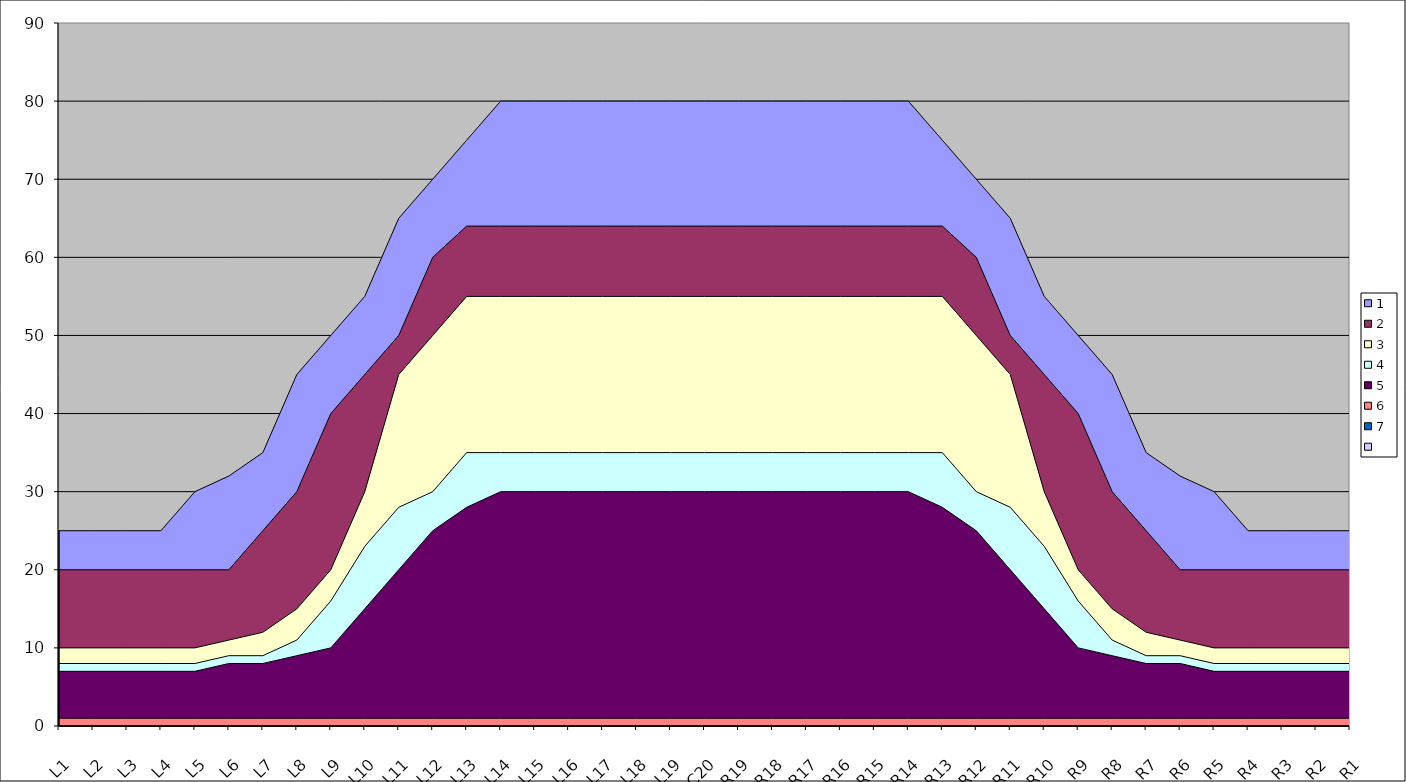
| Category | 1 | 2 | 3 | 4 | 5 | 6 | 7 |
|---|---|---|---|---|---|---|---|
| L1 | 25 | 20 | 10 | 8 | 7 | 1 |  |
| L2 | 25 | 20 | 10 | 8 | 7 | 1 |  |
| L3 | 25 | 20 | 10 | 8 | 7 | 1 |  |
| L4 | 25 | 20 | 10 | 8 | 7 | 1 |  |
| L5 | 30 | 20 | 10 | 8 | 7 | 1 |  |
| L6 | 32 | 20 | 11 | 9 | 8 | 1 |  |
| L7 | 35 | 25 | 12 | 9 | 8 | 1 |  |
| L8 | 45 | 30 | 15 | 11 | 9 | 1 |  |
| L9 | 50 | 40 | 20 | 16 | 10 | 1 |  |
| L10 | 55 | 45 | 30 | 23 | 15 | 1 |  |
| L11 | 65 | 50 | 45 | 28 | 20 | 1 |  |
| L12 | 70 | 60 | 50 | 30 | 25 | 1 |  |
| L13 | 75 | 64 | 55 | 35 | 28 | 1 |  |
| L14 | 80 | 64 | 55 | 35 | 30 | 1 |  |
| L15 | 80 | 64 | 55 | 35 | 30 | 1 |  |
| L16 | 80 | 64 | 55 | 35 | 30 | 1 |  |
| L17 | 80 | 64 | 55 | 35 | 30 | 1 |  |
| L18 | 80 | 64 | 55 | 35 | 30 | 1 |  |
| L19 | 80 | 64 | 55 | 35 | 30 | 1 |  |
| C20 | 80 | 64 | 55 | 35 | 30 | 1 |  |
| R19 | 80 | 64 | 55 | 35 | 30 | 1 |  |
| R18 | 80 | 64 | 55 | 35 | 30 | 1 |  |
| R17 | 80 | 64 | 55 | 35 | 30 | 1 |  |
| R16 | 80 | 64 | 55 | 35 | 30 | 1 |  |
| R15 | 80 | 64 | 55 | 35 | 30 | 1 |  |
| R14 | 80 | 64 | 55 | 35 | 30 | 1 |  |
| R13 | 75 | 64 | 55 | 35 | 28 | 1 |  |
| R12 | 70 | 60 | 50 | 30 | 25 | 1 |  |
| R11 | 65 | 50 | 45 | 28 | 20 | 1 |  |
| R10 | 55 | 45 | 30 | 23 | 15 | 1 |  |
| R9 | 50 | 40 | 20 | 16 | 10 | 1 |  |
| R8 | 45 | 30 | 15 | 11 | 9 | 1 |  |
| R7 | 35 | 25 | 12 | 9 | 8 | 1 |  |
| R6 | 32 | 20 | 11 | 9 | 8 | 1 |  |
| R5 | 30 | 20 | 10 | 8 | 7 | 1 |  |
| R4 | 25 | 20 | 10 | 8 | 7 | 1 |  |
| R3 | 25 | 20 | 10 | 8 | 7 | 1 |  |
| R2 | 25 | 20 | 10 | 8 | 7 | 1 |  |
| R1 | 25 | 20 | 10 | 8 | 7 | 1 |  |